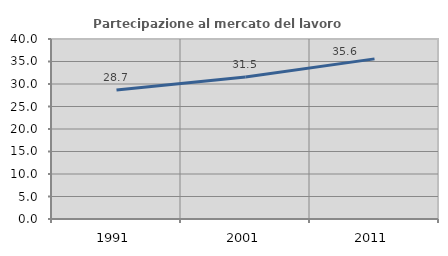
| Category | Partecipazione al mercato del lavoro  femminile |
|---|---|
| 1991.0 | 28.669 |
| 2001.0 | 31.532 |
| 2011.0 | 35.585 |